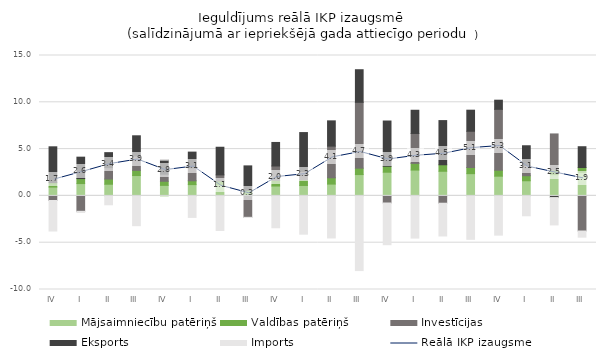
| Category | Mājsaimniecību patēriņš | Valdības patēriņš | Investīcijas | Eksports | Imports |
|---|---|---|---|---|---|
| IV | 0.942 | 0.471 | -0.494 | 3.832 | -3.257 |
| I | 1.316 | 0.534 | -1.648 | 2.287 | -0.128 |
| II | 1.246 | 0.556 | 1.217 | 1.602 | -0.949 |
| III | 2.174 | 0.555 | 1.539 | 2.154 | -3.18 |
| IV | 1.125 | 0.436 | 0.756 | 1.507 | 0.049 |
| I | 1.207 | 0.407 | 1.386 | 1.678 | -2.297 |
| II | 1.183 | 0.401 | 0.661 | 2.953 | -3.693 |
| III | 0.131 | 0.464 | -2.289 | 2.611 | -0.018 |
| IV | 1.054 | 0.617 | 1.525 | 2.515 | -3.403 |
| I | 1.114 | 0.616 | 0.894 | 4.141 | -4.09 |
| II | 1.261 | 0.675 | 3.382 | 2.7 | -4.493 |
| III | 2.278 | 0.685 | 7.034 | 3.484 | -7.979 |
| IV | 2.53 | 0.637 | -0.759 | 4.833 | -4.453 |
| I | 2.759 | 0.712 | 3.199 | 2.479 | -4.507 |
| II | 2.632 | 0.695 | -0.782 | 4.719 | -3.499 |
| III | 2.377 | 0.659 | 3.869 | 2.252 | -4.638 |
| IV | 2.106 | 0.639 | 6.506 | 0.974 | -4.192 |
| I | 1.617 | 0.538 | 1.088 | 2.114 | -2.124 |
| II | 2.268 | 0.503 | 3.849 | -0.18 | -2.919 |
| III | 2.516 | 0.515 | -3.751 | 2.222 | -0.658 |